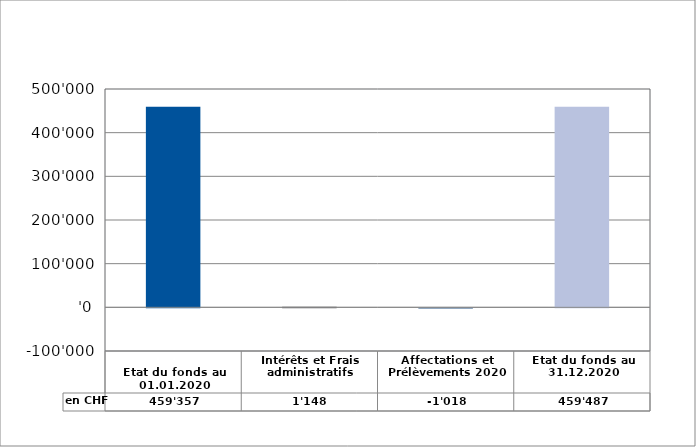
| Category | en CHF |
|---|---|
| 
Etat du fonds au 01.01.2020

 | 459356.82 |
| Intérêts et Frais administratifs | 1148.4 |
| Affectations et Prélèvements 2020 | -1017.77 |
| Etat du fonds au 31.12.2020 | 459487.45 |